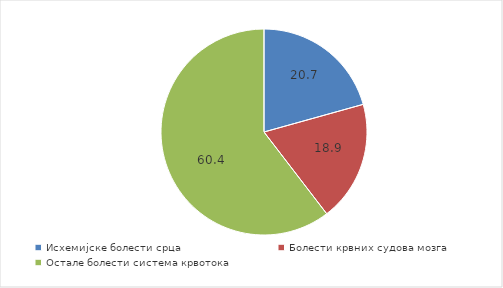
| Category | Series 0 |
|---|---|
| Исхемијске болести срца  | 20.674 |
| Болести крвних судова мозга  | 18.912 |
| Остале болести система крвотока  | 60.414 |